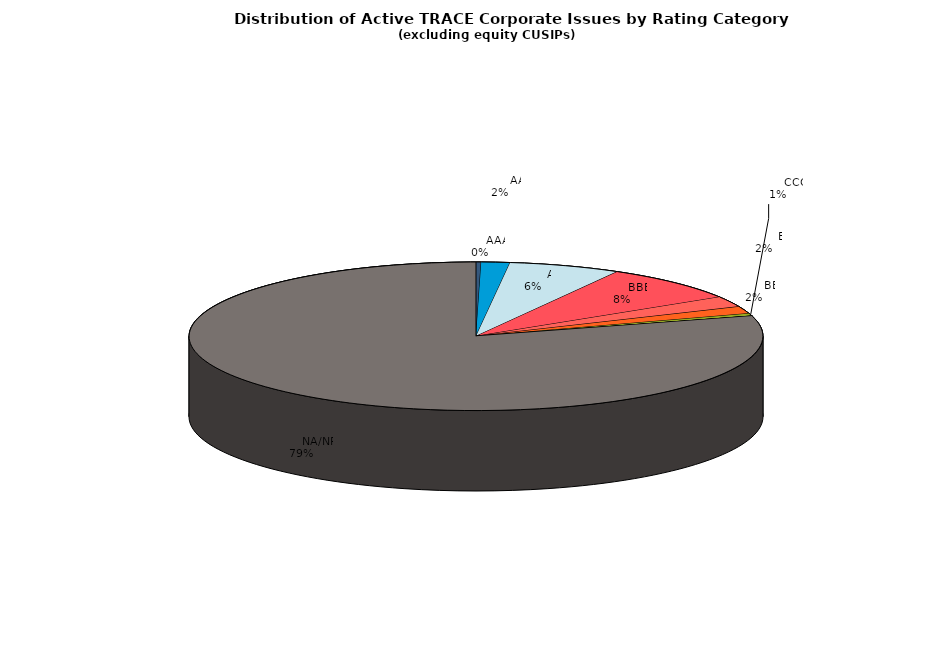
| Category | Series 0 |
|---|---|
|         AAA | 473 |
|         AA | 2626 |
|         A | 10276 |
|         BBB | 12978 |
|         BB | 3775 |
|         B | 2576 |
|         CCC | 867 |
|         CC | 28 |
|         C | 15 |
|         D | 30 |
|         NA/NR | 129474 |